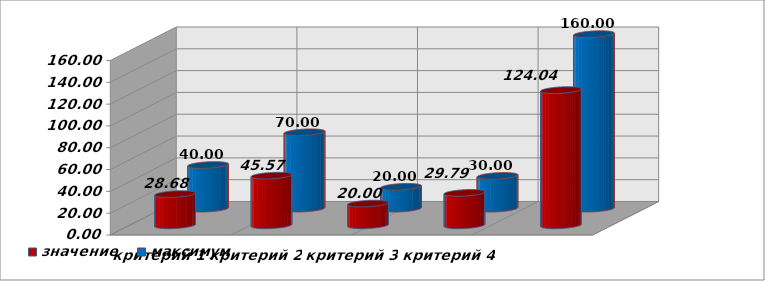
| Category | значение | максимум |
|---|---|---|
| критерий 1 | 28.68 | 40 |
| критерий 2 | 45.57 | 70 |
| критерий 3 | 20 | 20 |
| критерий 4 | 29.79 | 30 |